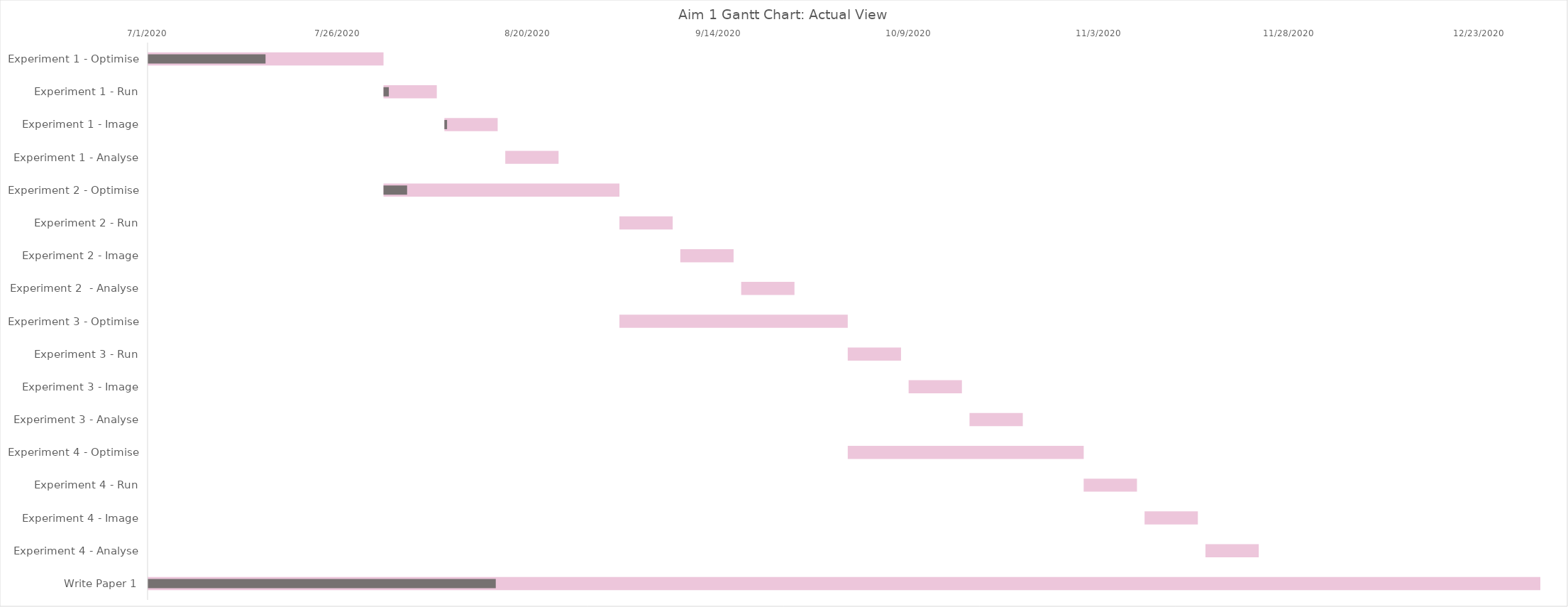
| Category | Start Date | # Days |
|---|---|---|
| Experiment 1 - Optimise | 7/1/20 | 31 |
| Experiment 1 - Run | 8/1/20 | 7 |
| Experiment 1 - Image | 8/9/20 | 7 |
| Experiment 1 - Analyse | 8/17/20 | 7 |
| Experiment 2 - Optimise | 8/1/20 | 31 |
| Experiment 2 - Run | 9/1/20 | 7 |
| Experiment 2 - Image | 9/9/20 | 7 |
| Experiment 2  - Analyse | 9/17/20 | 7 |
| Experiment 3 - Optimise | 9/1/20 | 30 |
| Experiment 3 - Run | 10/1/20 | 7 |
| Experiment 3 - Image | 10/9/20 | 7 |
| Experiment 3 - Analyse | 10/17/20 | 7 |
| Experiment 4 - Optimise | 10/1/20 | 31 |
| Experiment 4 - Run | 11/1/20 | 7 |
| Experiment 4 - Image | 11/9/20 | 7 |
| Experiment 4 - Analyse | 11/17/20 | 7 |
| Write Paper 1 | 7/1/20 | 183 |